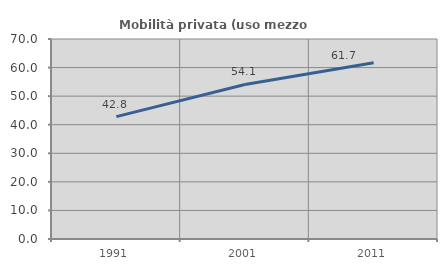
| Category | Mobilità privata (uso mezzo privato) |
|---|---|
| 1991.0 | 42.825 |
| 2001.0 | 54.103 |
| 2011.0 | 61.719 |